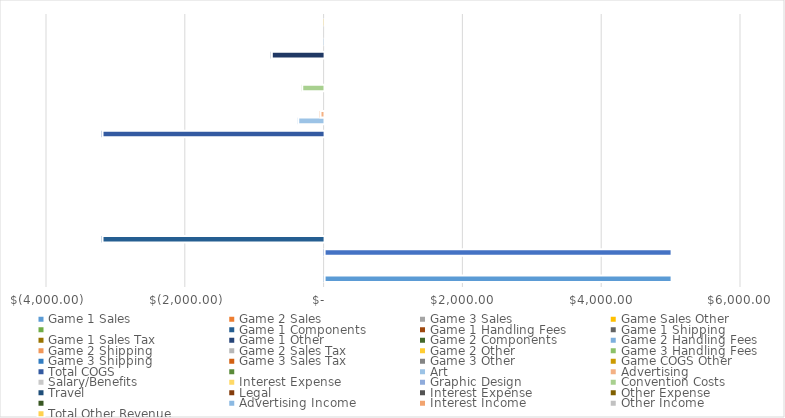
| Category | Game 1 Sales | Game 2 Sales | Game 3 Sales | Game Sales Other | Total Game Sales | Series 5 | Game 1 Components | Game 1 Handling Fees | Game 1 Shipping | Game 1 Sales Tax | Game 1 Other | Game 2 Components | Game 2 Handling Fees | Game 2 Shipping | Game 2 Sales Tax | Game 2 Other | Game 3 Components | Game 3 Handling Fees | Game 3 Shipping | Game 3 Sales Tax | Game 3 Other | Game COGS Other | Total COGS | Series 23 | Art | Advertising | Salary/Benefits | Interest Expense | Graphic Design | Convention Costs | Travel | Legal | Other Expense | Total Expenses | Series 35 | Advertising Income | Interest Income | Other Income | Total Other Revenue |
|---|---|---|---|---|---|---|---|---|---|---|---|---|---|---|---|---|---|---|---|---|---|---|---|---|---|---|---|---|---|---|---|---|---|---|---|---|---|---|---|
| 0 | 5000 | 0 | 0 | 0 | 5000 |  | -3200 | 0 | 0 | 0 | 0 | 0 | 0 | 0 | 0 | 0 | 0 | 0 | 0 | 0 | 0 | 0 | -3200 |  | -379 | -60 | 0 | 0 | 0 | -321.52 | 0 | 0 | 0 | -760.52 |  | 20 | 0 | 0 | 20 |